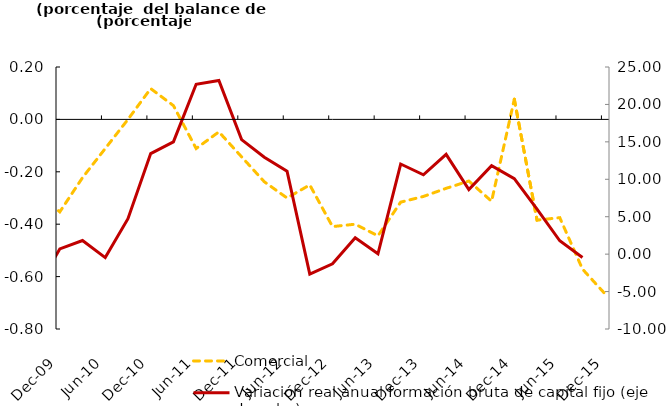
| Category | Comercial |
|---|---|
| 2008-03-01 | -0.167 |
| 2008-07-01 | -0.643 |
| 2008-10-01 | -0.714 |
| 2008-12-01 | -0.733 |
| 2009-03-01 | -0.5 |
| 2009-06-01 | -0.526 |
| 2009-09-01 | -0.278 |
| 2009-12-01 | -0.353 |
| 2010-03-01 | -0.222 |
| 2010-06-01 | -0.111 |
| 2010-09-01 | 0 |
| 2010-12-01 | 0.118 |
| 2011-03-01 | 0.053 |
| 2011-06-01 | -0.111 |
| 2011-09-01 | -0.048 |
| 2011-12-01 | -0.143 |
| 2012-03-01 | -0.238 |
| 2012-06-01 | -0.3 |
| 2012-09-01 | -0.25 |
| 2012-12-01 | -0.409 |
| 2013-03-01 | -0.4 |
| 2013-06-01 | -0.444 |
| 2013-09-01 | -0.316 |
| 2013-12-01 | -0.294 |
| 2014-03-01 | -0.263 |
| 2014-06-01 | -0.235 |
| 2014-09-01 | -0.312 |
| 2014-12-01 | 0.077 |
| 2015-03-01 | -0.385 |
| 2015-06-01 | -0.375 |
| 2015-09-01 | -0.571 |
| 2015-12-01 | -0.667 |